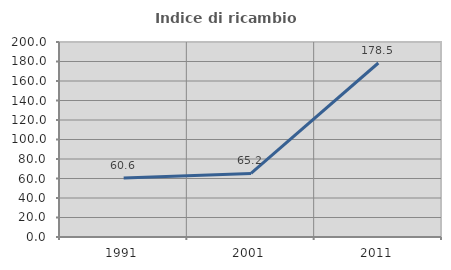
| Category | Indice di ricambio occupazionale  |
|---|---|
| 1991.0 | 60.563 |
| 2001.0 | 65.217 |
| 2011.0 | 178.462 |